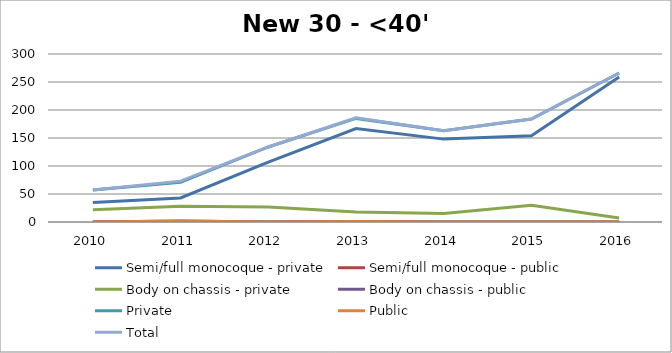
| Category | Semi/full monocoque - private | Semi/full monocoque - public | Body on chassis - private | Body on chassis - public | Private | Public | Total |
|---|---|---|---|---|---|---|---|
| 2010.0 | 35 | 0 | 22 | 0 | 57 | 0 | 57 |
| 2011.0 | 43 | 0 | 28 | 2 | 71 | 2 | 73 |
| 2012.0 | 107 | 0 | 27 | 0 | 134 | 0 | 134 |
| 2013.0 | 167 | 0 | 18 | 1 | 185 | 1 | 186 |
| 2014.0 | 148 | 0 | 15 | 0 | 163 | 0 | 163 |
| 2015.0 | 154 | 0 | 30 | 0 | 184 | 0 | 184 |
| 2016.0 | 259 | 0 | 7 | 0 | 266 | 0 | 266 |